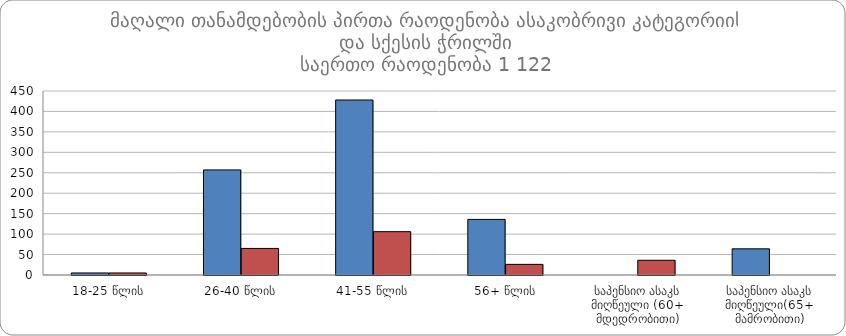
| Category | მამრობითი | მდედრობითი |
|---|---|---|
| 18-25 წლის | 5 | 5 |
| 26-40 წლის | 257 | 65 |
| 41-55 წლის | 428 | 106 |
| 56+ წლის | 136 | 26 |
| საპენსიო ასაკს მიღწეული (60+ მდედრობითი) | 0 | 36 |
| საპენსიო ასაკს მიღწეული(65+ მამრობითი) | 64 | 0 |